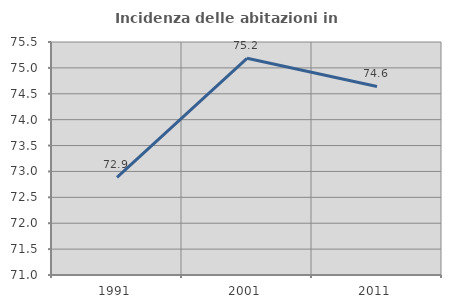
| Category | Incidenza delle abitazioni in proprietà  |
|---|---|
| 1991.0 | 72.886 |
| 2001.0 | 75.185 |
| 2011.0 | 74.641 |